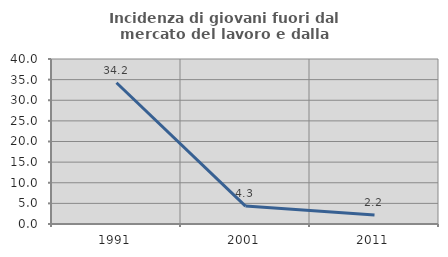
| Category | Incidenza di giovani fuori dal mercato del lavoro e dalla formazione  |
|---|---|
| 1991.0 | 34.247 |
| 2001.0 | 4.348 |
| 2011.0 | 2.174 |